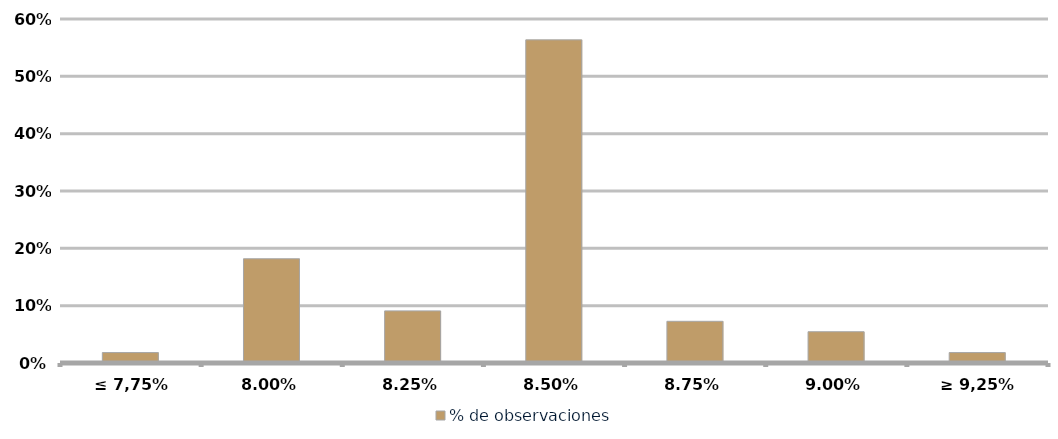
| Category | % de observaciones  |
|---|---|
| ≤ 7,75% | 0.018 |
| 8,00% | 0.182 |
| 8,25% | 0.091 |
| 8,50% | 0.564 |
| 8,75% | 0.073 |
| 9,00% | 0.055 |
| ≥ 9,25% | 0.018 |